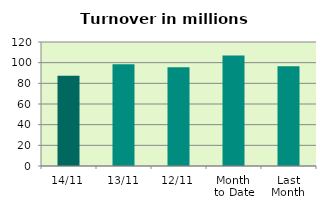
| Category | Series 0 |
|---|---|
| 14/11 | 87.224 |
| 13/11 | 98.407 |
| 12/11 | 95.544 |
| Month 
to Date | 107.045 |
| Last
Month | 96.433 |